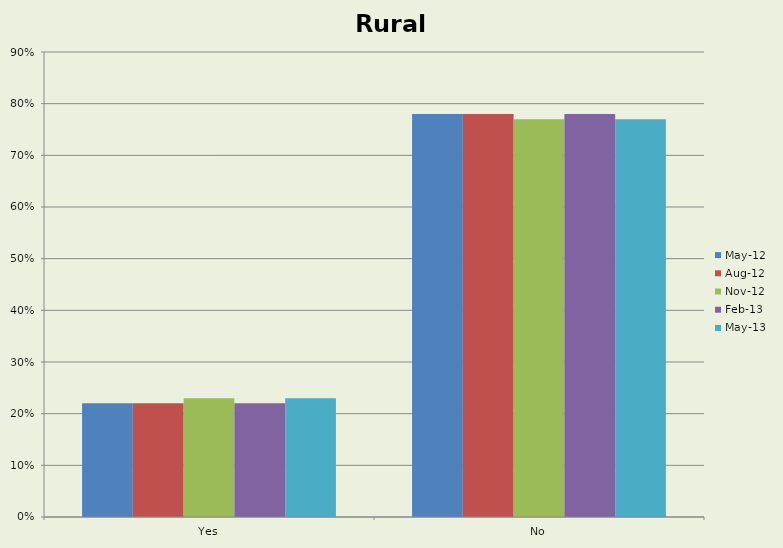
| Category | May-12 | Aug-12 | Nov-12 | Feb-13 | May-13 |
|---|---|---|---|---|---|
| Yes | 0.22 | 0.22 | 0.23 | 0.22 | 0.23 |
| No | 0.78 | 0.78 | 0.77 | 0.78 | 0.77 |